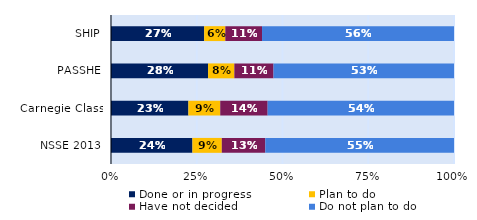
| Category | Done or in progress | Plan to do | Have not decided | Do not plan to do |
|---|---|---|---|---|
| SHIP | 0.272 | 0.062 | 0.107 | 0.56 |
| PASSHE | 0.283 | 0.077 | 0.114 | 0.526 |
| Carnegie Class | 0.226 | 0.093 | 0.138 | 0.543 |
| NSSE 2013 | 0.237 | 0.086 | 0.127 | 0.55 |